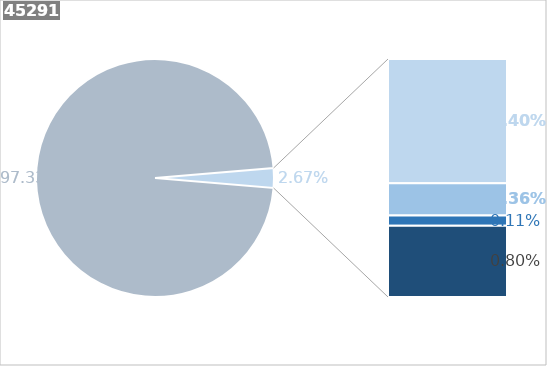
| Category | Series 0 |
|---|---|
| 0 | 0.973 |
| 1 | 0.014 |
| 2 | 0.004 |
| 3 | 0.001 |
| 4 | 0.008 |